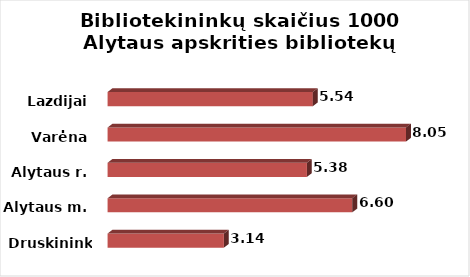
| Category | Series 0 |
|---|---|
| Druskininkai | 3.137 |
| Alytaus m. | 6.6 |
| Alytaus r. | 5.376 |
| Varėna | 8.049 |
| Lazdijai | 5.536 |